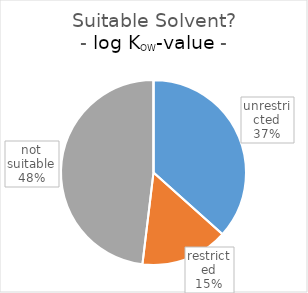
| Category | Series 0 |
|---|---|
| 0 | 67 |
| 1 | 28 |
| 2 | 88 |
| 3 | 0 |